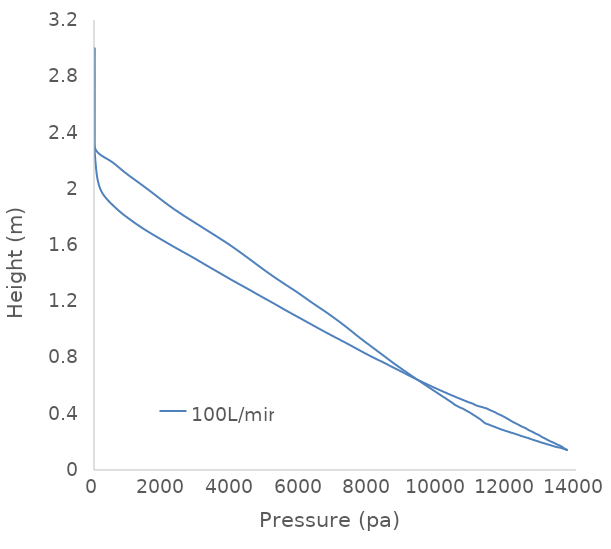
| Category | 100L/min |
|---|---|
| 13759.9 | 0.14 |
| 13732.4 | 0.144 |
| 13723.6 | 0.145 |
| 13715.3 | 0.146 |
| 13705.4 | 0.148 |
| 13702.4 | 0.148 |
| 13684.7 | 0.15 |
| 13645.5 | 0.155 |
| 13622.0 | 0.16 |
| 13616.6 | 0.161 |
| 13604.4 | 0.163 |
| 13592.1 | 0.165 |
| 13589.1 | 0.165 |
| 13550.3 | 0.171 |
| 13541.2 | 0.172 |
| 13504.0 | 0.176 |
| 13473.7 | 0.179 |
| 13461.9 | 0.181 |
| 13459.7 | 0.181 |
| 13457.1 | 0.181 |
| 13452.7 | 0.182 |
| 13447.1 | 0.182 |
| 13441.2 | 0.183 |
| 13428.4 | 0.185 |
| 13375.2 | 0.192 |
| 13356.3 | 0.194 |
| 13286.9 | 0.2 |
| 13285.0 | 0.201 |
| 13280.7 | 0.201 |
| 13278.1 | 0.201 |
| 13275.6 | 0.202 |
| 13272.6 | 0.202 |
| 13184.9 | 0.213 |
| 13181.8 | 0.213 |
| 13178.2 | 0.214 |
| 13173.7 | 0.214 |
| 13170.3 | 0.215 |
| 13097.3 | 0.224 |
| 13093.5 | 0.225 |
| 13090.6 | 0.225 |
| 13086.0 | 0.226 |
| 13078.3 | 0.227 |
| 13057.8 | 0.229 |
| 13051.6 | 0.23 |
| 12998.3 | 0.237 |
| 12985.9 | 0.239 |
| 12965.9 | 0.242 |
| 12914.7 | 0.249 |
| 12913.4 | 0.25 |
| 12908.7 | 0.25 |
| 12899.7 | 0.251 |
| 12899.3 | 0.251 |
| 12891.6 | 0.252 |
| 12890.9 | 0.252 |
| 12890.6 | 0.252 |
| 12830.6 | 0.259 |
| 12827.6 | 0.259 |
| 12782.0 | 0.265 |
| 12778.7 | 0.265 |
| 12775.1 | 0.266 |
| 12773.4 | 0.266 |
| 12718.2 | 0.273 |
| 12706.3 | 0.274 |
| 12706.3 | 0.274 |
| 12705.3 | 0.275 |
| 12699.9 | 0.275 |
| 12699.3 | 0.275 |
| 12668.8 | 0.279 |
| 12625.8 | 0.284 |
| 12618.8 | 0.285 |
| 12612.6 | 0.286 |
| 12607.5 | 0.286 |
| 12563.6 | 0.293 |
| 12546.4 | 0.296 |
| 12546.3 | 0.296 |
| 12545.6 | 0.296 |
| 12542.8 | 0.297 |
| 12534.9 | 0.298 |
| 12529.7 | 0.298 |
| 12490.4 | 0.302 |
| 12445.4 | 0.307 |
| 12437.3 | 0.308 |
| 12432.5 | 0.308 |
| 12430.2 | 0.308 |
| 12424.4 | 0.309 |
| 12410.2 | 0.311 |
| 12408.9 | 0.311 |
| 12400.3 | 0.312 |
| 12334.1 | 0.321 |
| 12325.9 | 0.322 |
| 12320.7 | 0.323 |
| 12268.7 | 0.329 |
| 12261.7 | 0.33 |
| 12251.8 | 0.331 |
| 12243.7 | 0.332 |
| 12240.2 | 0.333 |
| 12234.9 | 0.333 |
| 12233.3 | 0.333 |
| 12170.4 | 0.341 |
| 12166.4 | 0.342 |
| 12155.7 | 0.343 |
| 12145.5 | 0.345 |
| 12122.5 | 0.348 |
| 12122.4 | 0.348 |
| 12122.2 | 0.348 |
| 12121.9 | 0.348 |
| 12112.8 | 0.35 |
| 12103.8 | 0.351 |
| 12079.7 | 0.355 |
| 12078.6 | 0.355 |
| 12052.4 | 0.359 |
| 12042.5 | 0.36 |
| 12041.2 | 0.36 |
| 12037.2 | 0.361 |
| 12029.9 | 0.362 |
| 12022.6 | 0.363 |
| 11969.7 | 0.37 |
| 11964.1 | 0.371 |
| 11956.4 | 0.372 |
| 11940.0 | 0.374 |
| 11907.6 | 0.379 |
| 11901.4 | 0.38 |
| 11890.1 | 0.381 |
| 11835.2 | 0.388 |
| 11834.4 | 0.388 |
| 11826.3 | 0.389 |
| 11823.4 | 0.389 |
| 11820.0 | 0.39 |
| 11803.6 | 0.392 |
| 11783.8 | 0.394 |
| 11738.9 | 0.398 |
| 11723.4 | 0.401 |
| 11721.9 | 0.401 |
| 11720.8 | 0.401 |
| 11642.8 | 0.411 |
| 11638.4 | 0.412 |
| 11636.8 | 0.412 |
| 11628.3 | 0.413 |
| 11627.7 | 0.413 |
| 11626.1 | 0.413 |
| 11578.5 | 0.418 |
| 11526.7 | 0.423 |
| 11524.4 | 0.424 |
| 11518.7 | 0.424 |
| 11515.5 | 0.425 |
| 11445.7 | 0.433 |
| 11415.2 | 0.436 |
| 11412.6 | 0.437 |
| 11405.0 | 0.437 |
| 11337.2 | 0.442 |
| 11272.4 | 0.447 |
| 11271.1 | 0.447 |
| 11270.5 | 0.447 |
| 11266.5 | 0.448 |
| 11261.3 | 0.448 |
| 11257.6 | 0.448 |
| 11246.3 | 0.449 |
| 11230.3 | 0.45 |
| 11138.4 | 0.456 |
| 11132.7 | 0.457 |
| 11127.4 | 0.457 |
| 11094.4 | 0.46 |
| 11051.9 | 0.465 |
| 11050.9 | 0.465 |
| 11020.4 | 0.47 |
| 11020.1 | 0.47 |
| 11019.5 | 0.47 |
| 11019.3 | 0.47 |
| 10899.1 | 0.48 |
| 10793.4 | 0.491 |
| 10688.1 | 0.501 |
| 10583.9 | 0.511 |
| 10481.5 | 0.522 |
| 10381.4 | 0.532 |
| 10283.0 | 0.542 |
| 10185.8 | 0.553 |
| 10089.6 | 0.563 |
| 9994.39 | 0.574 |
| 9900.41 | 0.584 |
| 9808.05 | 0.594 |
| 9717.44 | 0.605 |
| 9627.96 | 0.615 |
| 9538.96 | 0.625 |
| 9450.5 | 0.636 |
| 9363.04 | 0.646 |
| 9276.95 | 0.656 |
| 9192.41 | 0.667 |
| 9109.25 | 0.677 |
| 9026.89 | 0.687 |
| 8944.55 | 0.698 |
| 8861.63 | 0.708 |
| 8778.14 | 0.718 |
| 8694.47 | 0.729 |
| 8610.92 | 0.739 |
| 8527.65 | 0.75 |
| 8444.27 | 0.76 |
| 8359.62 | 0.77 |
| 8273.18 | 0.781 |
| 8186.29 | 0.791 |
| 8100.84 | 0.801 |
| 8017.51 | 0.812 |
| 7936.06 | 0.822 |
| 7856.0 | 0.832 |
| 7776.79 | 0.843 |
| 7698.22 | 0.853 |
| 7620.4 | 0.863 |
| 7543.24 | 0.874 |
| 7466.18 | 0.884 |
| 7388.43 | 0.894 |
| 7309.32 | 0.905 |
| 7228.86 | 0.915 |
| 7147.78 | 0.926 |
| 7066.66 | 0.936 |
| 6985.65 | 0.946 |
| 6904.9 | 0.957 |
| 6824.72 | 0.967 |
| 6745.3 | 0.977 |
| 6666.74 | 0.988 |
| 6589.09 | 0.998 |
| 6512.23 | 1.008 |
| 6435.6 | 1.019 |
| 6358.73 | 1.029 |
| 6281.74 | 1.039 |
| 6205.27 | 1.05 |
| 6129.6 | 1.06 |
| 6054.0 | 1.07 |
| 5977.35 | 1.081 |
| 5899.67 | 1.091 |
| 5821.89 | 1.102 |
| 5744.6 | 1.112 |
| 5667.88 | 1.122 |
| 5591.95 | 1.133 |
| 5517.07 | 1.143 |
| 5443.14 | 1.153 |
| 5369.7 | 1.164 |
| 5296.18 | 1.174 |
| 5221.8 | 1.184 |
| 5146.18 | 1.195 |
| 5069.74 | 1.205 |
| 4993.14 | 1.215 |
| 4916.81 | 1.226 |
| 4841.03 | 1.236 |
| 4765.96 | 1.246 |
| 4691.64 | 1.257 |
| 4617.71 | 1.267 |
| 4543.38 | 1.278 |
| 4468.04 | 1.288 |
| 4391.67 | 1.298 |
| 4314.69 | 1.309 |
| 4237.35 | 1.319 |
| 4160.13 | 1.329 |
| 4083.89 | 1.34 |
| 4009.16 | 1.35 |
| 3935.61 | 1.36 |
| 3862.57 | 1.371 |
| 3789.61 | 1.381 |
| 3716.66 | 1.391 |
| 3643.64 | 1.402 |
| 3570.4 | 1.412 |
| 3497.06 | 1.422 |
| 3423.78 | 1.433 |
| 3350.55 | 1.443 |
| 3277.48 | 1.454 |
| 3204.9 | 1.464 |
| 3132.92 | 1.474 |
| 3061.29 | 1.485 |
| 2989.77 | 1.495 |
| 2917.78 | 1.505 |
| 2844.36 | 1.516 |
| 2769.2 | 1.526 |
| 2692.99 | 1.536 |
| 2616.57 | 1.547 |
| 2540.33 | 1.557 |
| 2464.45 | 1.567 |
| 2389.1 | 1.578 |
| 2314.44 | 1.588 |
| 2240.41 | 1.598 |
| 2166.96 | 1.609 |
| 2094.23 | 1.619 |
| 2022.08 | 1.63 |
| 1950.07 | 1.64 |
| 1877.93 | 1.65 |
| 1805.72 | 1.661 |
| 1733.78 | 1.671 |
| 1662.67 | 1.681 |
| 1592.79 | 1.692 |
| 1524.17 | 1.702 |
| 1454.13 | 1.713 |
| 1382.07 | 1.724 |
| 1309.3 | 1.736 |
| 1239.37 | 1.748 |
| 1175.34 | 1.759 |
| 1116.71 | 1.769 |
| 1058.45 | 1.779 |
| 1000.03 | 1.79 |
| 942.259 | 1.8 |
| 886.317 | 1.81 |
| 832.718 | 1.821 |
| 781.294 | 1.831 |
| 731.668 | 1.842 |
| 683.685 | 1.852 |
| 637.251 | 1.862 |
| 591.875 | 1.873 |
| 547.095 | 1.883 |
| 503.212 | 1.893 |
| 460.88 | 1.904 |
| 420.39 | 1.914 |
| 381.808 | 1.924 |
| 345.207 | 1.935 |
| 310.765 | 1.945 |
| 279.046 | 1.955 |
| 250.652 | 1.966 |
| 225.717 | 1.976 |
| 204.107 | 1.986 |
| 185.528 | 1.997 |
| 169.307 | 2.007 |
| 154.844 | 2.018 |
| 141.977 | 2.028 |
| 130.493 | 2.038 |
| 120.073 | 2.049 |
| 110.573 | 2.059 |
| 101.964 | 2.069 |
| 94.218 | 2.08 |
| 87.3051 | 2.09 |
| 81.1564 | 2.1 |
| 75.6045 | 2.111 |
| 70.4874 | 2.121 |
| 65.7511 | 2.131 |
| 61.3767 | 2.142 |
| 57.2923 | 2.152 |
| 53.3958 | 2.162 |
| 49.6007 | 2.173 |
| 45.8358 | 2.183 |
| 42.1048 | 2.194 |
| 38.5105 | 2.204 |
| 35.0834 | 2.214 |
| 31.7374 | 2.225 |
| 28.5114 | 2.235 |
| 25.6412 | 2.245 |
| 23.269 | 2.256 |
| 21.3083 | 2.266 |
| 19.6361 | 2.276 |
| 18.1833 | 2.287 |
| 16.9083 | 2.297 |
| 15.8145 | 2.307 |
| 14.9249 | 2.318 |
| 14.2392 | 2.328 |
| 13.73 | 2.338 |
| 13.3622 | 2.349 |
| 13.1028 | 2.359 |
| 12.9178 | 2.37 |
| 12.7769 | 2.38 |
| 12.6633 | 2.39 |
| 12.5706 | 2.401 |
| 12.4957 | 2.411 |
| 12.4404 | 2.421 |
| 12.408 | 2.432 |
| 12.3935 | 2.442 |
| 12.3868 | 2.452 |
| 12.382 | 2.463 |
| 12.3776 | 2.473 |
| 12.3734 | 2.483 |
| 12.3693 | 2.494 |
| 12.3652 | 2.504 |
| 12.361 | 2.514 |
| 12.3568 | 2.525 |
| 12.3525 | 2.535 |
| 12.3482 | 2.546 |
| 12.3439 | 2.556 |
| 12.3396 | 2.566 |
| 12.3352 | 2.577 |
| 12.3309 | 2.587 |
| 12.3265 | 2.597 |
| 12.3222 | 2.608 |
| 12.3178 | 2.618 |
| 12.3134 | 2.628 |
| 12.3091 | 2.639 |
| 12.3047 | 2.649 |
| 12.3002 | 2.659 |
| 12.2958 | 2.67 |
| 12.2914 | 2.68 |
| 12.287 | 2.69 |
| 12.2825 | 2.701 |
| 12.2781 | 2.711 |
| 12.2736 | 2.722 |
| 12.2691 | 2.732 |
| 12.2647 | 2.742 |
| 12.2602 | 2.753 |
| 12.2557 | 2.763 |
| 12.2513 | 2.773 |
| 12.2467 | 2.784 |
| 12.2423 | 2.794 |
| 12.2378 | 2.804 |
| 12.2333 | 2.815 |
| 12.2288 | 2.825 |
| 12.2243 | 2.835 |
| 12.2198 | 2.846 |
| 12.2153 | 2.856 |
| 12.2108 | 2.866 |
| 12.2063 | 2.877 |
| 12.2017 | 2.887 |
| 12.1972 | 2.898 |
| 12.1927 | 2.908 |
| 12.1883 | 2.918 |
| 12.1841 | 2.929 |
| 12.18 | 2.939 |
| 12.1756 | 2.949 |
| 12.1696 | 2.96 |
| 12.1606 | 2.97 |
| 12.1606 | 2.97 |
| 12.1591 | 2.98 |
| 12.1788 | 2.99 |
| 12.2197 | 3 |
| 12.2196 | 3 |
| 12.2193 | 3 |
| 12.1804 | 3 |
| 12.1028 | 3 |
| 12.0649 | 3 |
| 12.0597 | 3 |
| 12.0585 | 3 |
| 12.0623 | 3 |
| 12.0679 | 3 |
| 12.0746 | 3 |
| 12.0808 | 3 |
| 12.0817 | 3 |
| 12.1017 | 3 |
| 12.0997 | 3 |
| 12.0999 | 3 |
| 12.1031 | 3 |
| 12.1058 | 3 |
| 11.5909 | 3 |
| 11.5903 | 3 |
| 11.5897 | 3 |
| 11.5896 | 3 |
| 11.5874 | 3 |
| 11.5869 | 3 |
| 11.5868 | 3 |
| 11.5859 | 2.997 |
| 11.5803 | 2.988 |
| 11.576 | 2.978 |
| 11.5896 | 2.969 |
| 11.6568 | 2.959 |
| 11.7812 | 2.95 |
| 11.9037 | 2.94 |
| 11.9756 | 2.93 |
| 12.0168 | 2.92 |
| 12.0417 | 2.91 |
| 12.0574 | 2.9 |
| 12.0672 | 2.89 |
| 12.0731 | 2.88 |
| 12.0764 | 2.87 |
| 12.078 | 2.86 |
| 12.0786 | 2.85 |
| 12.079 | 2.83 |
| 12.079 | 2.811 |
| 12.0788 | 2.791 |
| 12.0786 | 2.771 |
| 12.0783 | 2.752 |
| 12.078 | 2.732 |
| 12.0775 | 2.712 |
| 12.0769 | 2.692 |
| 12.0762 | 2.673 |
| 12.0752 | 2.653 |
| 12.0738 | 2.633 |
| 12.072 | 2.614 |
| 12.0698 | 2.594 |
| 12.0671 | 2.574 |
| 12.0636 | 2.555 |
| 12.0591 | 2.535 |
| 12.0535 | 2.515 |
| 12.0462 | 2.495 |
| 12.0368 | 2.476 |
| 12.0248 | 2.456 |
| 12.0097 | 2.436 |
| 11.9928 | 2.417 |
| 11.9774 | 2.397 |
| 11.9723 | 2.377 |
| 12.0058 | 2.358 |
| 12.2587 | 2.338 |
| 13.7041 | 2.318 |
| 21.5354 | 2.298 |
| 47.5165 | 2.279 |
| 103.975 | 2.259 |
| 198.632 | 2.239 |
| 327.418 | 2.22 |
| 463.709 | 2.2 |
| 580.873 | 2.18 |
| 680.094 | 2.16 |
| 776.633 | 2.14 |
| 876.318 | 2.12 |
| 980.714 | 2.101 |
| 1089.38 | 2.081 |
| 1201.13 | 2.061 |
| 1313.99 | 2.041 |
| 1425.36 | 2.021 |
| 1534.16 | 2.001 |
| 1641.34 | 1.981 |
| 1747.26 | 1.961 |
| 1851.79 | 1.941 |
| 1956.12 | 1.922 |
| 2062.22 | 1.902 |
| 2171.62 | 1.882 |
| 2285.04 | 1.862 |
| 2402.57 | 1.842 |
| 2524.07 | 1.822 |
| 2649.26 | 1.802 |
| 2777.14 | 1.782 |
| 2906.01 | 1.763 |
| 3034.53 | 1.743 |
| 3162.77 | 1.723 |
| 3291.48 | 1.703 |
| 3420.26 | 1.683 |
| 3548.69 | 1.663 |
| 3676.66 | 1.643 |
| 3802.37 | 1.623 |
| 3924.31 | 1.603 |
| 4042.88 | 1.584 |
| 4158.34 | 1.564 |
| 4270.87 | 1.544 |
| 4381.79 | 1.524 |
| 4492.41 | 1.504 |
| 4602.61 | 1.484 |
| 4711.97 | 1.464 |
| 4821.39 | 1.444 |
| 4931.96 | 1.424 |
| 5044.28 | 1.405 |
| 5159.37 | 1.385 |
| 5159.37 | 1.385 |
| 5277.65 | 1.365 |
| 5398.27 | 1.345 |
| 5520.74 | 1.325 |
| 5645.19 | 1.305 |
| 5770.3 | 1.285 |
| 5892.85 | 1.265 |
| 6010.96 | 1.246 |
| 6125.88 | 1.226 |
| 6240.44 | 1.206 |
| 6357.05 | 1.186 |
| 6476.94 | 1.166 |
| 6598.88 | 1.146 |
| 6719.09 | 1.126 |
| 6835.25 | 1.106 |
| 6948.34 | 1.086 |
| 7059.56 | 1.067 |
| 7168.74 | 1.047 |
| 7275.37 | 1.027 |
| 7379.18 | 1.007 |
| 7480.44 | 0.987 |
| 7580.58 | 0.967 |
| 7682.06 | 0.947 |
| 7786.68 | 0.927 |
| 7894.35 | 0.907 |
| 8003.78 | 0.888 |
| 8113.35 | 0.868 |
| 8221.89 | 0.848 |
| 8329.45 | 0.828 |
| 8436.73 | 0.808 |
| 8544.71 | 0.788 |
| 8654.37 | 0.768 |
| 8766.29 | 0.748 |
| 8880.66 | 0.729 |
| 8997.05 | 0.709 |
| 9114.62 | 0.689 |
| 9232.8 | 0.669 |
| 9351.58 | 0.649 |
| 9471.25 | 0.629 |
| 9592.2 | 0.609 |
| 9714.82 | 0.589 |
| 9838.58 | 0.569 |
| 9962.1 | 0.55 |
| 10085.4 | 0.53 |
| 10209.8 | 0.51 |
| 10333.3 | 0.49 |
| 10450.9 | 0.47 |
| 10450.9 | 0.47 |
| 10451.0 | 0.47 |
| 10453.7 | 0.469 |
| 10454.3 | 0.469 |
| 10455.0 | 0.469 |
| 10455.7 | 0.468 |
| 10460.5 | 0.467 |
| 10461.0 | 0.467 |
| 10461.1 | 0.467 |
| 10461.5 | 0.467 |
| 10471.0 | 0.466 |
| 10471.0 | 0.466 |
| 10472.5 | 0.465 |
| 10474.0 | 0.465 |
| 10480.4 | 0.464 |
| 10493.9 | 0.462 |
| 10498.5 | 0.461 |
| 10502.7 | 0.46 |
| 10503.0 | 0.46 |
| 10518.1 | 0.459 |
| 10521.5 | 0.459 |
| 10531.9 | 0.457 |
| 10533.7 | 0.457 |
| 10534.3 | 0.457 |
| 10536.4 | 0.457 |
| 10552.1 | 0.455 |
| 10577.8 | 0.451 |
| 10595.5 | 0.449 |
| 10597.5 | 0.448 |
| 10602.9 | 0.448 |
| 10628.2 | 0.445 |
| 10645.2 | 0.443 |
| 10653.0 | 0.442 |
| 10656.5 | 0.442 |
| 10666.7 | 0.441 |
| 10671.9 | 0.44 |
| 10676.8 | 0.44 |
| 10721.5 | 0.435 |
| 10725.5 | 0.435 |
| 10759.3 | 0.43 |
| 10763.6 | 0.429 |
| 10764.3 | 0.429 |
| 10765.7 | 0.429 |
| 10774.4 | 0.428 |
| 10778.0 | 0.427 |
| 10782.2 | 0.427 |
| 10789.0 | 0.426 |
| 10806.1 | 0.423 |
| 10852.8 | 0.417 |
| 10861.9 | 0.416 |
| 10867.0 | 0.415 |
| 10874.3 | 0.414 |
| 10881.7 | 0.413 |
| 10905.6 | 0.41 |
| 10909.7 | 0.409 |
| 10930.1 | 0.406 |
| 10934.9 | 0.406 |
| 10939.7 | 0.405 |
| 10941.4 | 0.405 |
| 10941.6 | 0.405 |
| 10943.4 | 0.405 |
| 10943.6 | 0.405 |
| 10946.0 | 0.404 |
| 10963.4 | 0.401 |
| 10995.6 | 0.396 |
| 11000.7 | 0.395 |
| 11004.5 | 0.395 |
| 11006.7 | 0.394 |
| 11064.1 | 0.385 |
| 11068.0 | 0.385 |
| 11072.1 | 0.384 |
| 11088.8 | 0.382 |
| 11099.5 | 0.38 |
| 11117.4 | 0.377 |
| 11137.3 | 0.374 |
| 11143.1 | 0.373 |
| 11154.5 | 0.371 |
| 11166.5 | 0.369 |
| 11184.1 | 0.366 |
| 11189.5 | 0.365 |
| 11197.3 | 0.364 |
| 11203.6 | 0.363 |
| 11230.3 | 0.358 |
| 11236.8 | 0.357 |
| 11251.0 | 0.355 |
| 11260.4 | 0.353 |
| 11268.0 | 0.351 |
| 11270.7 | 0.351 |
| 11281.1 | 0.348 |
| 11285.1 | 0.347 |
| 11292.2 | 0.346 |
| 11308.6 | 0.343 |
| 11310.9 | 0.342 |
| 11312.9 | 0.342 |
| 11316.6 | 0.341 |
| 11319.3 | 0.34 |
| 11319.3 | 0.34 |
| 11326.9 | 0.338 |
| 11335.2 | 0.337 |
| 11337.4 | 0.337 |
| 11344.7 | 0.335 |
| 11351.2 | 0.334 |
| 11352.2 | 0.334 |
| 11364.8 | 0.333 |
| 11389.3 | 0.329 |
| 11393.1 | 0.329 |
| 11413.4 | 0.327 |
| 11440.3 | 0.325 |
| 11448.8 | 0.325 |
| 11466.8 | 0.323 |
| 11477.2 | 0.322 |
| 11482.2 | 0.321 |
| 11495.3 | 0.32 |
| 11510.6 | 0.318 |
| 11530.0 | 0.316 |
| 11543.2 | 0.315 |
| 11552.3 | 0.315 |
| 11558.7 | 0.314 |
| 11567.7 | 0.313 |
| 11592.8 | 0.311 |
| 11612.4 | 0.309 |
| 11632.3 | 0.307 |
| 11657.4 | 0.305 |
| 11659.3 | 0.304 |
| 11678.8 | 0.302 |
| 11689.6 | 0.301 |
| 11690.6 | 0.301 |
| 11724.2 | 0.298 |
| 11737.2 | 0.297 |
| 11748.5 | 0.296 |
| 11768.9 | 0.294 |
| 11800.9 | 0.291 |
| 11801.5 | 0.291 |
| 11801.9 | 0.291 |
| 11817.1 | 0.29 |
| 11819.0 | 0.29 |
| 11844.0 | 0.287 |
| 11848.6 | 0.287 |
| 11865.8 | 0.286 |
| 11884.5 | 0.284 |
| 11905.5 | 0.282 |
| 11914.3 | 0.282 |
| 11935.3 | 0.28 |
| 11960.9 | 0.278 |
| 11965.9 | 0.278 |
| 12008.3 | 0.274 |
| 12016.2 | 0.274 |
| 12041.4 | 0.272 |
| 12049.3 | 0.271 |
| 12055.9 | 0.27 |
| 12086.1 | 0.268 |
| 12108.1 | 0.266 |
| 12160.0 | 0.262 |
| 12176.5 | 0.261 |
| 12182.3 | 0.261 |
| 12184.3 | 0.261 |
| 12191.6 | 0.26 |
| 12201.4 | 0.259 |
| 12215.1 | 0.258 |
| 12246.6 | 0.256 |
| 12274.5 | 0.254 |
| 12294.7 | 0.252 |
| 12304.2 | 0.251 |
| 12312.2 | 0.251 |
| 12353.3 | 0.247 |
| 12368.0 | 0.246 |
| 12376.3 | 0.245 |
| 12402.6 | 0.242 |
| 12429.0 | 0.24 |
| 12445.5 | 0.239 |
| 12476.9 | 0.237 |
| 12497.1 | 0.235 |
| 12514.7 | 0.234 |
| 12528.1 | 0.233 |
| 12532.6 | 0.233 |
| 12549.9 | 0.232 |
| 12592.2 | 0.228 |
| 12605.9 | 0.227 |
| 12619.9 | 0.226 |
| 12647.3 | 0.224 |
| 12657.3 | 0.223 |
| 12680.9 | 0.221 |
| 12692.4 | 0.22 |
| 12742.8 | 0.216 |
| 12744.2 | 0.216 |
| 12754.0 | 0.215 |
| 12761.6 | 0.214 |
| 12769.2 | 0.213 |
| 12796.1 | 0.211 |
| 12827.4 | 0.209 |
| 12834.3 | 0.208 |
| 12848.3 | 0.207 |
| 12861.9 | 0.206 |
| 12866.1 | 0.206 |
| 12919.4 | 0.202 |
| 12927.2 | 0.201 |
| 12958.9 | 0.198 |
| 12966.8 | 0.198 |
| 12995.7 | 0.195 |
| 13002.4 | 0.195 |
| 13077.7 | 0.19 |
| 13078.8 | 0.19 |
| 13086.3 | 0.189 |
| 13092.2 | 0.189 |
| 13095.1 | 0.189 |
| 13100.3 | 0.188 |
| 13104.0 | 0.188 |
| 13165.6 | 0.183 |
| 13198.2 | 0.181 |
| 13206.1 | 0.18 |
| 13244.2 | 0.178 |
| 13244.2 | 0.178 |
| 13251.7 | 0.177 |
| 13255.9 | 0.177 |
| 13294.9 | 0.174 |
| 13320.9 | 0.171 |
| 13321.8 | 0.171 |
| 13366.7 | 0.168 |
| 13368.3 | 0.168 |
| 13393.3 | 0.166 |
| 13397.8 | 0.165 |
| 13407.2 | 0.165 |
| 13410.9 | 0.165 |
| 13436.8 | 0.163 |
| 13541.7 | 0.159 |
| 13546.9 | 0.158 |
| 13548.4 | 0.158 |
| 13617.5 | 0.153 |
| 13624.7 | 0.152 |
| 13628.5 | 0.152 |
| 13631.2 | 0.151 |
| 13688.0 | 0.147 |
| 13702.8 | 0.145 |
| 13703.3 | 0.145 |
| 13728.0 | 0.143 |
| 13744.0 | 0.142 |
| 13759.9 | 0.14 |